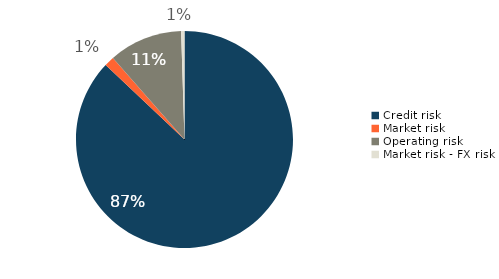
| Category | Series 0 |
|---|---|
| Credit risk | 0.871 |
| Market risk | 0.015 |
| Operating risk | 0.11 |
| Market risk - FX risk | 0.005 |